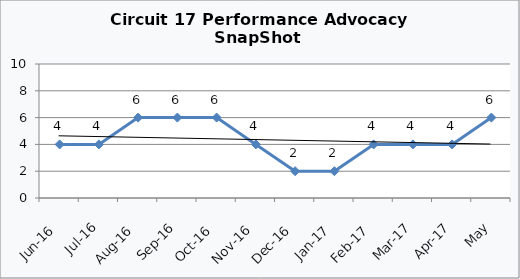
| Category | Circuit 17 |
|---|---|
| Jun-16 | 4 |
| Jul-16 | 4 |
| Aug-16 | 6 |
| Sep-16 | 6 |
| Oct-16 | 6 |
| Nov-16 | 4 |
| Dec-16 | 2 |
| Jan-17 | 2 |
| Feb-17 | 4 |
| Mar-17 | 4 |
| Apr-17 | 4 |
| May | 6 |